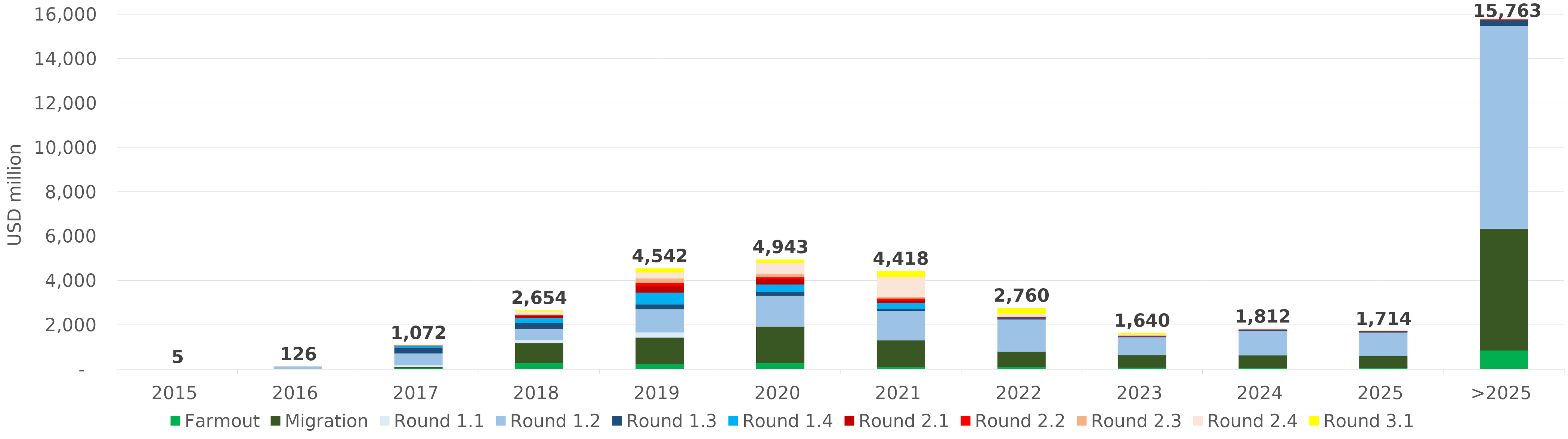
| Category | Farmout | Migration | Round 1.1 | Round 1.2 | Round 1.3 | Round 1.4 | Round 2.1 | Round 2.2 | Round 2.3 | Round 2.4 | Round 3.1 |
|---|---|---|---|---|---|---|---|---|---|---|---|
| 2015 | 0 | 0 | 4.573 | 0.236 | 0 | 0 | 0 | 0 | 0 | 0 | 0 |
| 2016 | 0 | 0 | 16.79 | 108.909 | 0 | 0 | 0 | 0 | 0 | 0 | 0 |
| 2017 | 50.877 | 65.422 | 76.429 | 533.486 | 231.789 | 93.443 | 18.851 | 1.29 | 0.72 | 0 | 0 |
| 2018 | 289.394 | 902.921 | 155.042 | 470.128 | 278.302 | 226.903 | 104.896 | 21.902 | 26.974 | 139.641 | 37.691 |
| 2019 | 241.207 | 1195.818 | 236.68 | 1049.68 | 207.126 | 540.649 | 302.09 | 133.009 | 199.161 | 270.262 | 166.186 |
| 2020 | 284.321 | 1655.641 | 6.736 | 1382.287 | 161.213 | 341.057 | 252.645 | 70.216 | 163.112 | 477.469 | 148.013 |
| 2021 | 118.804 | 1192.243 | 2.229 | 1327.977 | 92.463 | 274.593 | 98.126 | 94.017 | 75.914 | 902.96 | 238.674 |
| 2022 | 112.591 | 689.457 | 0 | 1456.781 | 44.141 | 10.69 | 22.683 | 31.916 | 2.635 | 142.246 | 247.297 |
| 2023 | 87.085 | 555.219 | 0 | 811.608 | 38.135 | 0.73 | 0.019 | 37.005 | 0.827 | 47.441 | 62.088 |
| 2024 | 79.455 | 553.791 | 0 | 1115.867 | 33.996 | 0 | 0 | 27.408 | 0 | 1.529 | 0 |
| 2025 | 75.288 | 530.69 | 0 | 1062.934 | 35.345 | 0 | 0 | 10.138 | 0 | 0 | 0 |
| >2025 | 859.226 | 5485.433 | 0 | 9144.06 | 249.076 | 0 | 0 | 24.866 | 0 | 0 | 0 |